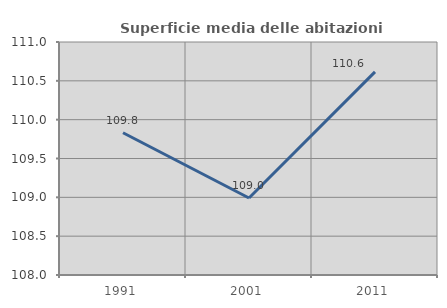
| Category | Superficie media delle abitazioni occupate |
|---|---|
| 1991.0 | 109.832 |
| 2001.0 | 108.991 |
| 2011.0 | 110.615 |